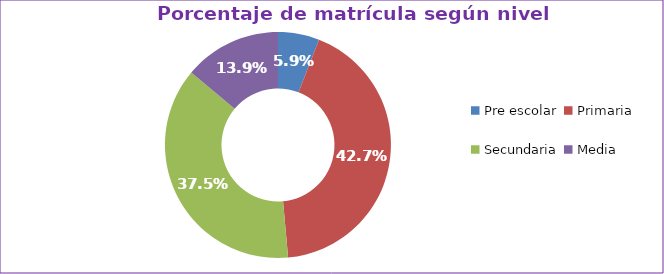
| Category | Series 0 |
|---|---|
| Pre escolar | 0.059 |
| Primaria | 0.427 |
| Secundaria | 0.375 |
| Media | 0.139 |